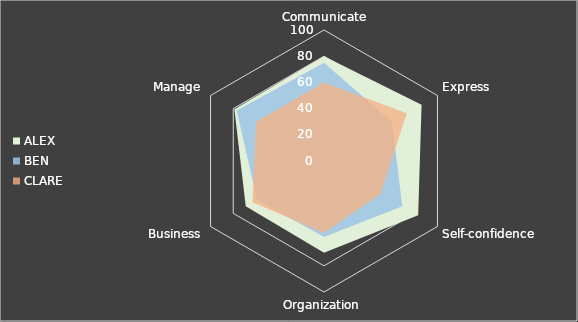
| Category | ALEX | BEN | CLARE |
|---|---|---|---|
|  Communicate | 80 | 75 | 60 |
| Express | 86 | 60 | 73 |
| Self-confidence | 83 | 69 | 50 |
| Organization | 70 | 58 | 55 |
| Business | 69 | 59 | 63 |
| Manage | 79 | 77 | 60 |